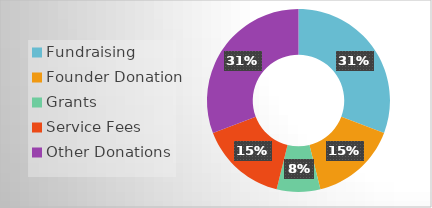
| Category | Series 0 |
|---|---|
| Fundraising | 0.308 |
| Founder Donation | 0.154 |
| Grants | 0.077 |
| Service Fees | 0.154 |
| Other Donations | 0.308 |